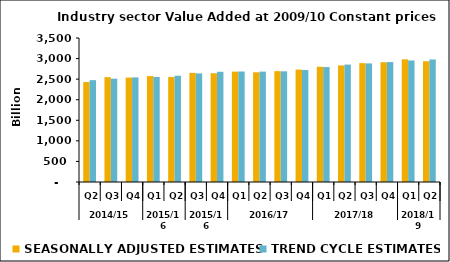
| Category | SEASONALLY ADJUSTED ESTIMATES | TREND CYCLE ESTIMATES |
|---|---|---|
| 0 | 2428.988 | 2475.036 |
| 1 | 2548.252 | 2511.442 |
| 2 | 2537.135 | 2542.783 |
| 3 | 2573.535 | 2552.749 |
| 4 | 2553.348 | 2582.467 |
| 5 | 2651.522 | 2639.523 |
| 6 | 2643.805 | 2679.193 |
| 7 | 2682.172 | 2685.677 |
| 8 | 2666.392 | 2682.832 |
| 9 | 2694.642 | 2689.711 |
| 10 | 2731.91 | 2721.354 |
| 11 | 2801.696 | 2794.31 |
| 12 | 2832.847 | 2853.543 |
| 13 | 2889.18 | 2882.41 |
| 14 | 2910.502 | 2914.7 |
| 15 | 2981.277 | 2952.681 |
| 16 | 2934.634 | 2977.371 |